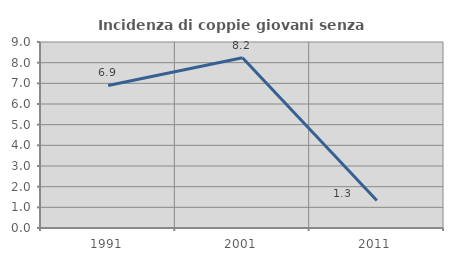
| Category | Incidenza di coppie giovani senza figli |
|---|---|
| 1991.0 | 6.897 |
| 2001.0 | 8.235 |
| 2011.0 | 1.333 |